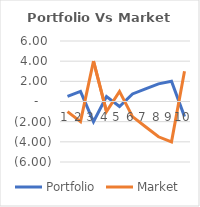
| Category | Portfolio | Market |
|---|---|---|
| 0 | 0.5 | -1 |
| 1 | 1 | -2 |
| 2 | -2 | 4 |
| 3 | 0.5 | -1 |
| 4 | -0.5 | 1 |
| 5 | 0.75 | -1.5 |
| 6 | 1.25 | -2.5 |
| 7 | 1.75 | -3.5 |
| 8 | 2 | -4 |
| 9 | -1.5 | 3 |